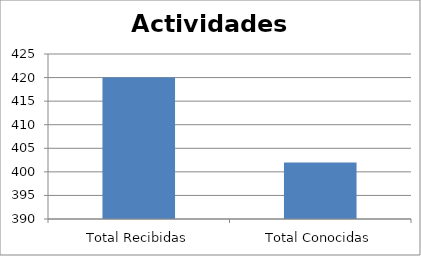
| Category | Series 0 |
|---|---|
| Total Recibidas | 420 |
| Total Conocidas | 402 |